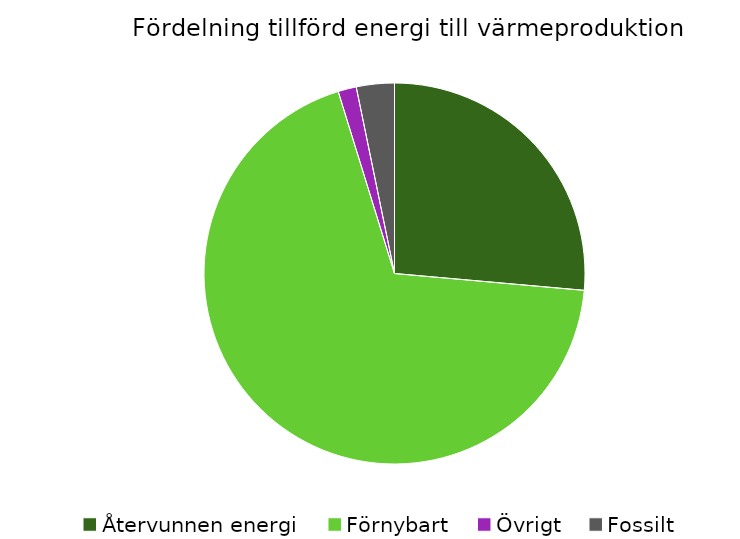
| Category | Fördelning värmeproduktion |
|---|---|
| Återvunnen energi | 0.264 |
| Förnybart | 0.688 |
| Övrigt | 0.016 |
| Fossilt | 0.032 |